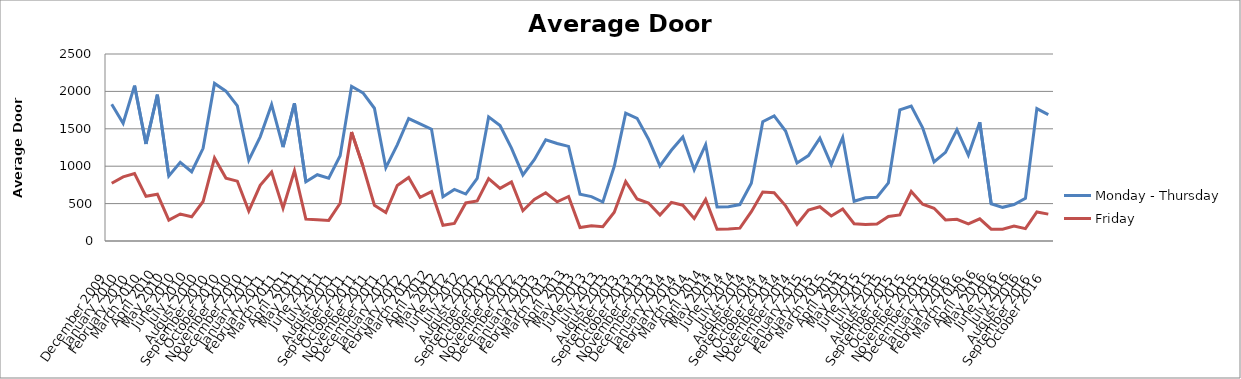
| Category | Monday - Thursday | Friday |
|---|---|---|
| December 2009 | 1827.726 | 771.42 |
| January 2010 | 1573.975 | 856.57 |
| February 2010 | 2076.815 | 900.64 |
| March 2010 | 1297.537 | 597.35 |
| April 2010 | 1955.965 | 625.144 |
| May 2010 | 869.226 | 278.33 |
| June 2010 | 1051.931 | 360.62 |
| July 2010 | 925.722 | 323.648 |
| August 2010 | 1238.958 | 527.8 |
| September 2010 | 2107.127 | 1109.42 |
| October 2010 | 2003.118 | 840.84 |
| November 2010 | 1805.931 | 800.28 |
| December 2010 | 1079.884 | 401.267 |
| January 2011 | 1392.101 | 744.25 |
| February 2011 | 1823.38 | 921.05 |
| March 2011 | 1254.787 | 438.75 |
| April 2011 | 1840.54 | 939.536 |
| May 2011 | 791.624 | 291.98 |
| June 2011 | 886.04 | 282.88 |
| July 2011 | 840.56 | 274.664 |
| August 2011 | 1139.594 | 504.01 |
| September 2011 | 2068.529 | 1456.728 |
| October 2011 | 1979.12 | 998.79 |
| November 2011 | 1774.962 | 478.66 |
| December 2011 | 980.258 | 380.293 |
| January 2012 | 1285.498 | 742.95 |
| February 2012 | 1637.419 | 849.29 |
| March 2012 | 1567 | 582.92 |
| April 2012 | 1493.685 | 658.84 |
| May 2012 | 592.453 | 210.99 |
| June 2012 | 689.488 | 234 |
| July 2012 | 627.915 | 509.21 |
| August 2012 | 836.242 | 535.6 |
| September 2012 | 1659.385 | 835.38 |
| October 2012 | 1544.126 | 704.08 |
| November 2012 | 1241.565 | 789.88 |
| December 2012 | 883.532 | 404.82 |
| January 2013 | 1086.916 | 554.84 |
| February 2013 | 1353.852 | 644.54 |
| March 2013 | 1303.857 | 524.03 |
| April 2013 | 1264.553 | 594.88 |
| May 2013 | 626.6 | 180.128 |
| June 2013 | 593.873 | 202.41 |
| July 2013 | 521.259 | 190.19 |
| August 2013 | 999.195 | 383.76 |
| September 2013 | 1708.46 | 794.56 |
| October 2013 | 1639.341 | 561.73 |
| November 2013 | 1360.905 | 507.936 |
| December 2013 | 1003.392 | 346.58 |
| January 2014 | 1213.129 | 515.944 |
| February 2014 | 1389.765 | 478.53 |
| March 2014 | 952.732 | 300.69 |
| April 2014 | 1287 | 555.62 |
| May 2014 | 455.948 | 158.184 |
| June 2014 | 459.221 | 159.25 |
| July 2014 | 487.048 | 171.34 |
| August 2014 | 771.127 | 391.56 |
| September 2014 | 1595.447 | 654.42 |
| October 2014 | 1671.8 | 645.216 |
| November 2014 | 1469.325 | 469.82 |
| December 2014 | 1042.08 | 223.427 |
| January 2015 | 1141.725 | 413.4 |
| February 2015 | 1375.725 | 457.73 |
| March 2015 | 1021.656 | 335.4 |
| April 2015 | 1383.171 | 428.09 |
| May 2015 | 531.408 | 231.088 |
| June 2015 | 578.673 | 221.52 |
| July 2015 | 586.04 | 227.63 |
| August 2015 | 777.675 | 328.9 |
| September 2015 | 1752.256 | 348.01 |
| October 2015 | 1804.461 | 661.96 |
| November 2015 | 1514.454 | 492.57 |
| December 2015 | 1056.782 | 437.493 |
| January 2016 | 1184.853 | 281.84 |
| February 2016 | 1487.628 | 290.42 |
| March 2016 | 1148.598 | 227.89 |
| April 2016 | 1587.69 | 297.128 |
| May 2016 | 497.64 | 158.47 |
| June 2016 | 450.176 | 158.08 |
| July 2016 | 488.085 | 199.784 |
| August 2016 | 570.139 | 165.1 |
| September 2016 | 1769.132 | 388.544 |
| October 2016 | 1689.358 | 359.58 |